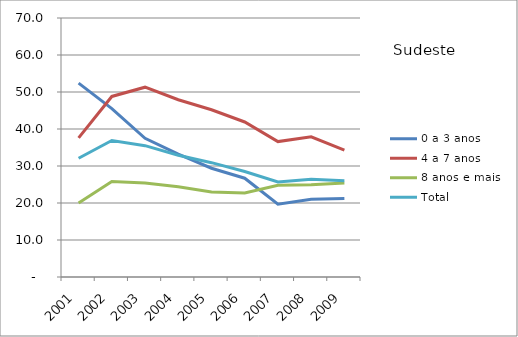
| Category | 0 a 3 anos | 4 a 7 anos | 8 anos e mais | Total |
|---|---|---|---|---|
| 2001.0 | 52.4 | 37.6 | 20 | 32.1 |
| 2002.0 | 45.5 | 48.8 | 25.8 | 36.9 |
| 2003.0 | 37.5 | 51.3 | 25.4 | 35.5 |
| 2004.0 | 33.2 | 47.9 | 24.4 | 32.9 |
| 2005.0 | 29.4 | 45.2 | 23 | 30.9 |
| 2006.0 | 26.7 | 41.9 | 22.7 | 28.5 |
| 2007.0 | 19.7 | 36.6 | 24.8 | 25.7 |
| 2008.0 | 21 | 37.9 | 24.9 | 26.4 |
| 2009.0 | 21.2 | 34.3 | 25.4 | 26 |